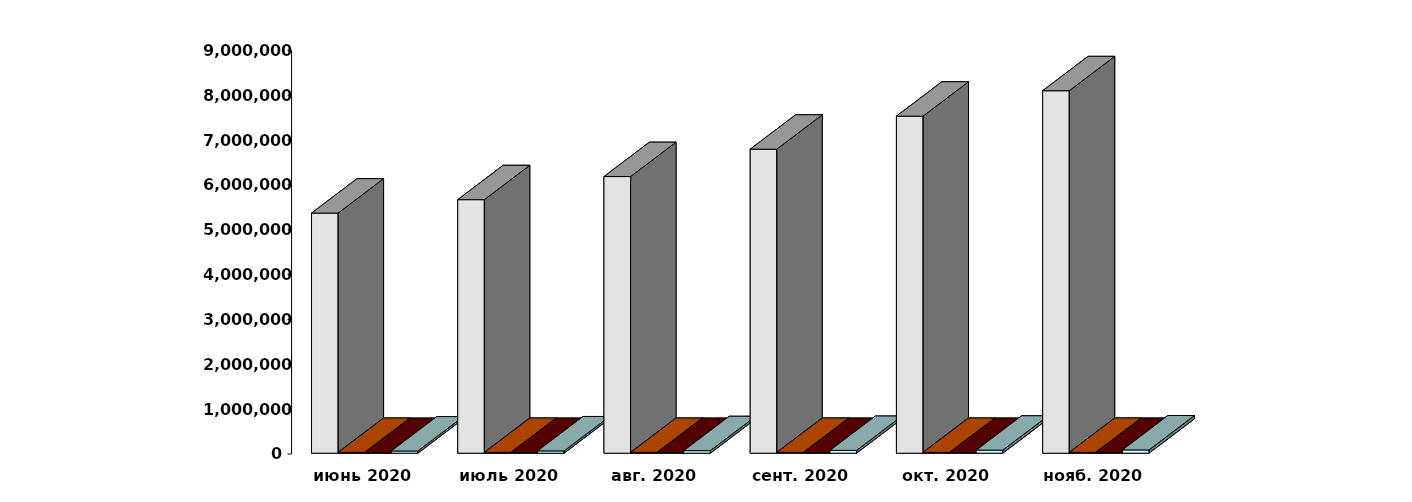
| Category | Физические лица | Юридические лица | Иностранные лица | Клиенты, передавшие свои средства в ДУ |
|---|---|---|---|---|
| 2020-06-30 | 5354906 | 18261 | 15817 | 49363 |
| 2020-07-30 | 5653690 | 18250 | 16100 | 51872 |
| 2020-08-30 | 6169141 | 18285 | 16204 | 57089 |
| 2020-09-30 | 6779757 | 18484 | 16494 | 62564 |
| 2020-10-30 | 7515934 | 18680 | 16861 | 67792 |
| 2020-11-30 | 8083085 | 18780 | 17081 | 73469 |